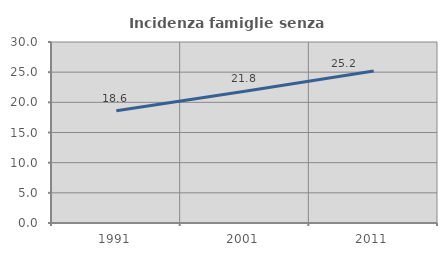
| Category | Incidenza famiglie senza nuclei |
|---|---|
| 1991.0 | 18.604 |
| 2001.0 | 21.825 |
| 2011.0 | 25.194 |